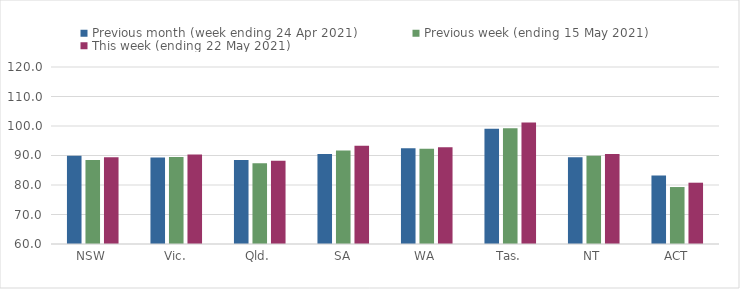
| Category | Previous month (week ending 24 Apr 2021) | Previous week (ending 15 May 2021) | This week (ending 22 May 2021) |
|---|---|---|---|
| NSW | 89.95 | 88.47 | 89.43 |
| Vic. | 89.33 | 89.49 | 90.34 |
| Qld. | 88.5 | 87.34 | 88.19 |
| SA | 90.49 | 91.73 | 93.28 |
| WA | 92.48 | 92.33 | 92.8 |
| Tas. | 99.06 | 99.26 | 101.22 |
| NT | 89.43 | 89.93 | 90.51 |
| ACT | 83.21 | 79.31 | 80.78 |